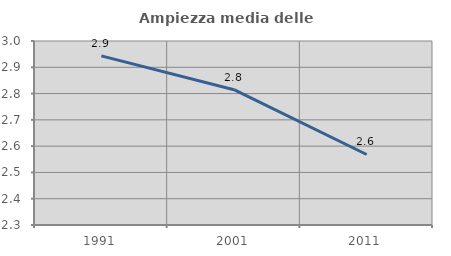
| Category | Ampiezza media delle famiglie |
|---|---|
| 1991.0 | 2.943 |
| 2001.0 | 2.815 |
| 2011.0 | 2.568 |